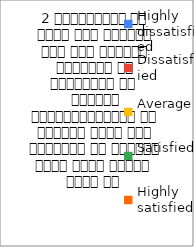
| Category | 2 व्याख्यान से रूचि में वृद्धि हुई एवं शिक्षण जानकारी से परिपूर्ण था 
शिक्षक विद्यार्थियों के द्वारा पूछे गये प्रश्नो का समाधान करने हेतु तत्पर  रहते है  |
|---|---|
| Highly dissatisfied | 0 |
| Dissatisfied | 1 |
| Average | 3 |
| Satisfied | 15 |
| Highly satisfied | 21 |